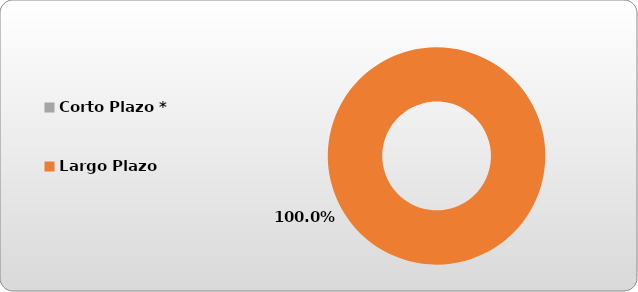
| Category | Corto Plazo * |
|---|---|
| Corto Plazo * | 0 |
| Largo Plazo | 46440.049 |